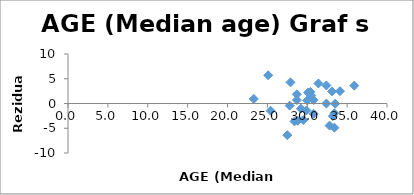
| Category | Series 0 |
|---|---|
| 33.5 | -0.043 |
| 32.8 | -4.463 |
| 33.4 | -1.976 |
| 27.8 | -0.43 |
| 27.9 | 4.28 |
| 33.2 | -2.563 |
| 30.8 | 0.698 |
| 32.4 | -0.018 |
| 29.2 | -1.041 |
| 28.7 | 0.704 |
| 25.1 | 5.697 |
| 35.9 | 3.612 |
| 31.4 | 4.051 |
| 30.1 | 2.202 |
| 34.1 | 2.49 |
| 30.5 | 1.611 |
| 30.0 | 0.608 |
| 32.4 | 3.654 |
| 28.7 | 1.87 |
| 33.4 | -4.885 |
| 29.9 | -1.406 |
| 23.3 | 0.927 |
| 27.5 | -6.394 |
| 29.5 | -3.336 |
| 25.4 | -1.458 |
| 28.8 | -3.493 |
| 33.1 | 2.445 |
| 30.8 | -2.068 |
| 28.4 | -3.622 |
| 30.4 | 2.347 |